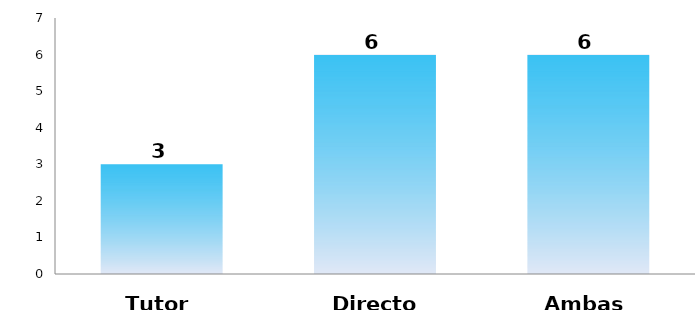
| Category | Series 0 |
|---|---|
| Tutor | 3 |
| Director | 6 |
| Ambas | 6 |